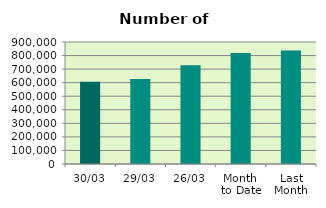
| Category | Series 0 |
|---|---|
| 30/03 | 605992 |
| 29/03 | 627092 |
| 26/03 | 728914 |
| Month 
to Date | 819352.273 |
| Last
Month | 836497.7 |